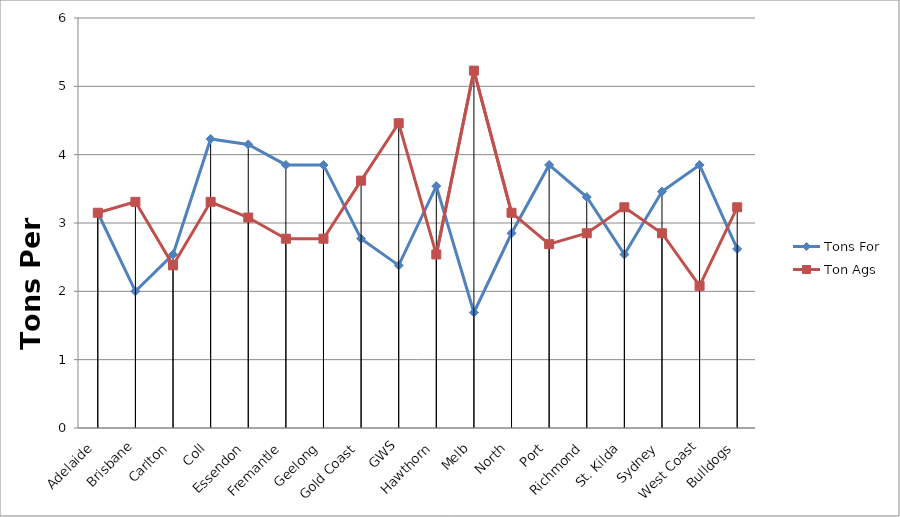
| Category | Tons For | Ton Ags |
|---|---|---|
| Adelaide | 3.15 | 3.15 |
| Brisbane | 2 | 3.31 |
| Carlton | 2.54 | 2.38 |
| Coll | 4.23 | 3.31 |
| Essendon | 4.15 | 3.08 |
| Fremantle | 3.85 | 2.77 |
| Geelong | 3.85 | 2.77 |
| Gold Coast | 2.77 | 3.62 |
| GWS | 2.38 | 4.46 |
| Hawthorn | 3.54 | 2.54 |
| Melb | 1.69 | 5.23 |
| North | 2.85 | 3.15 |
| Port | 3.85 | 2.69 |
| Richmond | 3.38 | 2.85 |
| St. Kilda | 2.54 | 3.23 |
| Sydney | 3.46 | 2.85 |
| West Coast | 3.85 | 2.08 |
| Bulldogs | 2.62 | 3.23 |